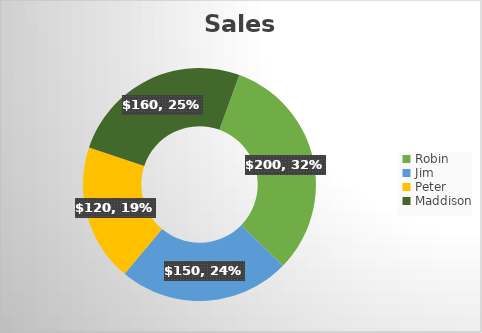
| Category | Series 0 |
|---|---|
| Robin | 200 |
| Jim | 150 |
| Peter | 120 |
| Maddison | 160 |